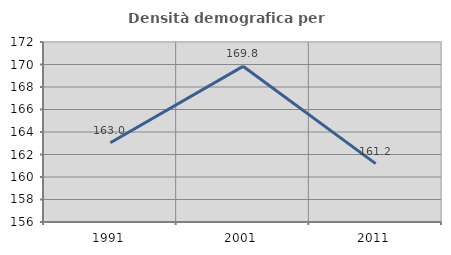
| Category | Densità demografica |
|---|---|
| 1991.0 | 163.043 |
| 2001.0 | 169.837 |
| 2011.0 | 161.191 |